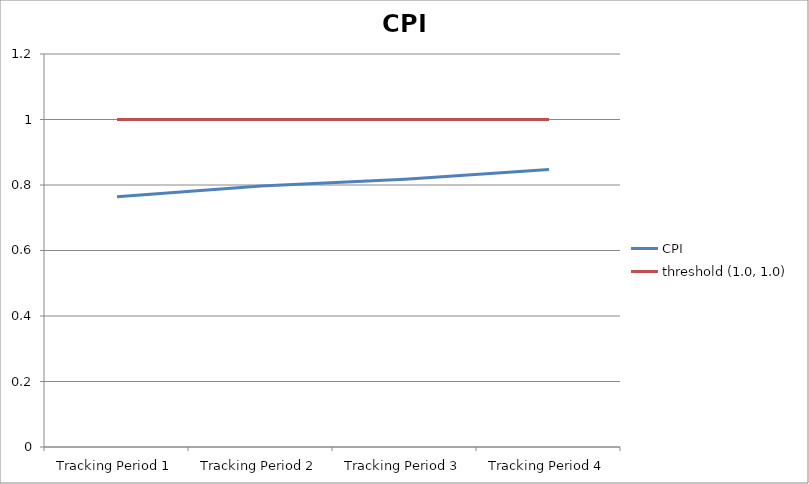
| Category | CPI | threshold (1.0, 1.0) |
|---|---|---|
| Tracking Period 1 | 0.764 | 1 |
| Tracking Period 2 | 0.797 | 1 |
| Tracking Period 3 | 0.818 | 1 |
| Tracking Period 4 | 0.847 | 1 |